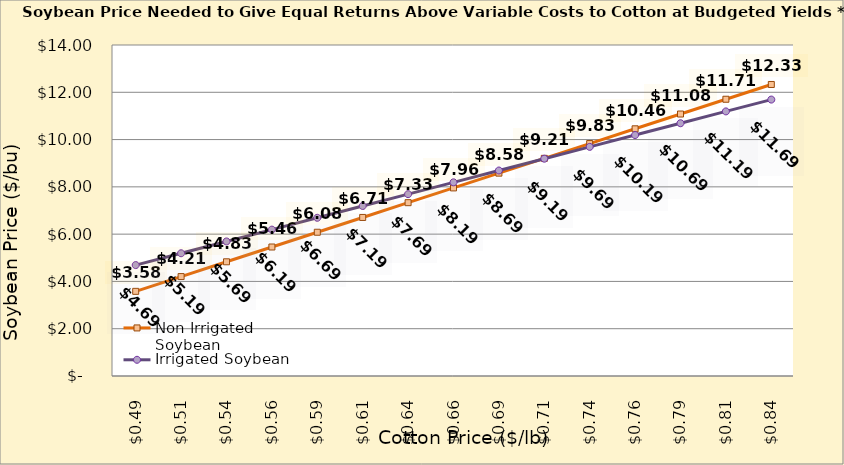
| Category | Non Irrigated Soybean | Irrigated Soybean |
|---|---|---|
| 0.4849999999999999 | 3.581 | 4.691 |
| 0.5099999999999999 | 4.206 | 5.191 |
| 0.5349999999999999 | 4.831 | 5.691 |
| 0.5599999999999999 | 5.456 | 6.191 |
| 0.585 | 6.081 | 6.691 |
| 0.61 | 6.706 | 7.191 |
| 0.635 | 7.331 | 7.691 |
| 0.66 | 7.956 | 8.191 |
| 0.685 | 8.581 | 8.691 |
| 0.7100000000000001 | 9.206 | 9.191 |
| 0.7350000000000001 | 9.831 | 9.691 |
| 0.7600000000000001 | 10.456 | 10.191 |
| 0.7850000000000001 | 11.081 | 10.691 |
| 0.8100000000000002 | 11.706 | 11.191 |
| 0.8350000000000002 | 12.331 | 11.691 |